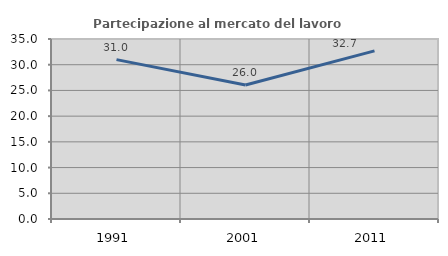
| Category | Partecipazione al mercato del lavoro  femminile |
|---|---|
| 1991.0 | 30.989 |
| 2001.0 | 26.047 |
| 2011.0 | 32.684 |